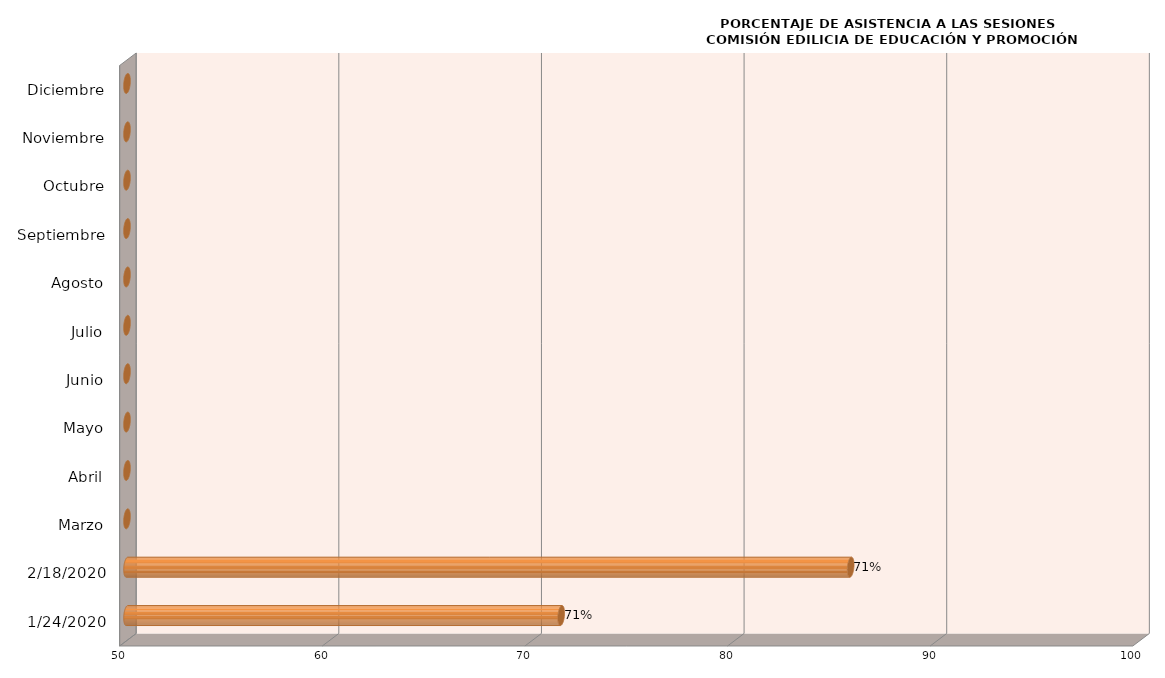
| Category | Series 0 |
|---|---|
| 24/01/2020 | 71.429 |
| 18/02/2020 | 85.714 |
| Marzo | 0 |
| Abril | 0 |
| Mayo | 0 |
| Junio | 0 |
| Julio | 0 |
| Agosto | 0 |
| Septiembre | 0 |
| Octubre | 0 |
| Noviembre | 0 |
| Diciembre | 0 |